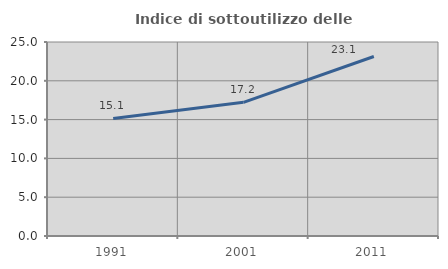
| Category | Indice di sottoutilizzo delle abitazioni  |
|---|---|
| 1991.0 | 15.142 |
| 2001.0 | 17.222 |
| 2011.0 | 23.131 |